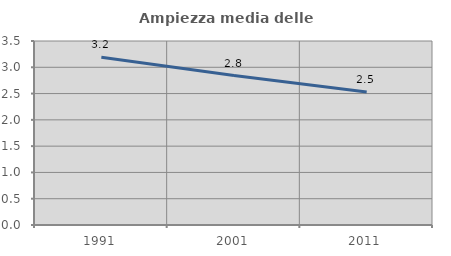
| Category | Ampiezza media delle famiglie |
|---|---|
| 1991.0 | 3.19 |
| 2001.0 | 2.842 |
| 2011.0 | 2.529 |